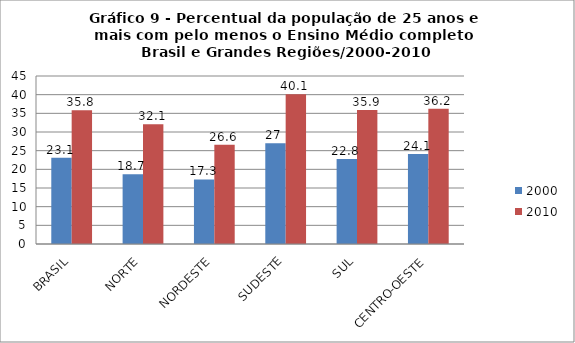
| Category | 2000 | 2010 |
|---|---|---|
| BRASIL | 23.1 | 35.8 |
| NORTE | 18.7 | 32.1 |
| NORDESTE | 17.3 | 26.6 |
| SUDESTE | 27 | 40.1 |
| SUL | 22.8 | 35.9 |
| CENTRO-OESTE | 24.1 | 36.2 |